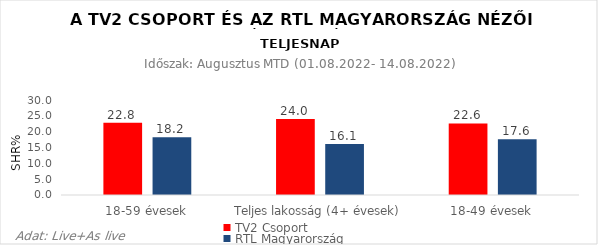
| Category | TV2 Csoport | RTL Magyarország |
|---|---|---|
| 18-59 évesek | 22.8 | 18.2 |
| Teljes lakosság (4+ évesek) | 24 | 16.1 |
| 18-49 évesek | 22.6 | 17.6 |